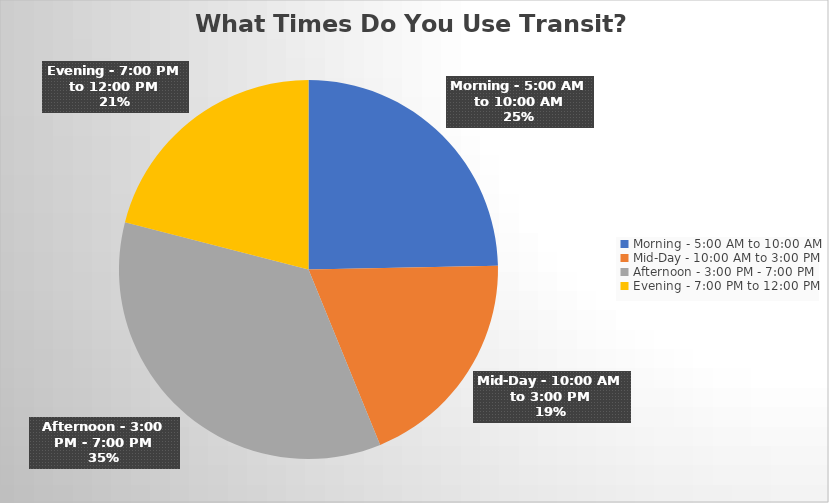
| Category | Series 0 |
|---|---|
| Morning - 5:00 AM to 10:00 AM | 40 |
| Mid-Day - 10:00 AM to 3:00 PM | 31 |
| Afternoon - 3:00 PM - 7:00 PM | 57 |
| Evening - 7:00 PM to 12:00 PM | 34 |